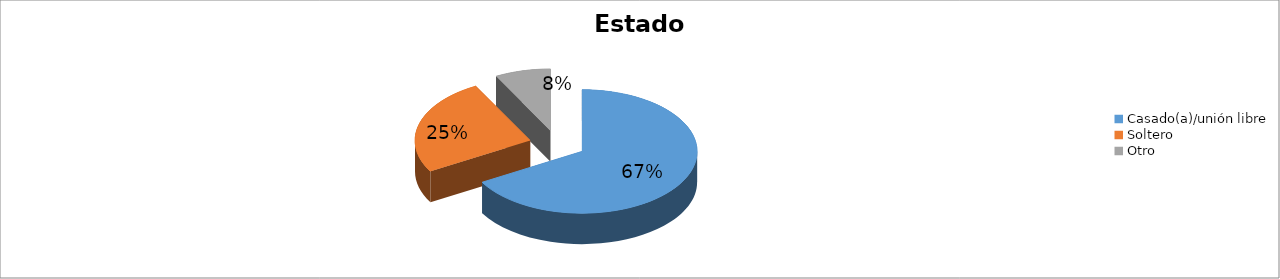
| Category | Series 0 |
|---|---|
| Casado(a)/unión libre | 0.667 |
| Soltero | 0.255 |
| Otro | 0.078 |